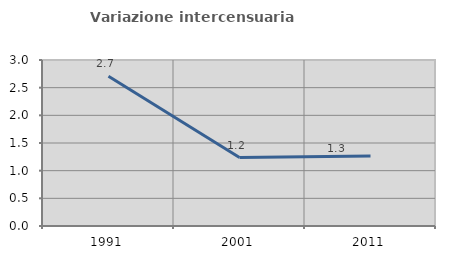
| Category | Variazione intercensuaria annua |
|---|---|
| 1991.0 | 2.707 |
| 2001.0 | 1.237 |
| 2011.0 | 1.267 |